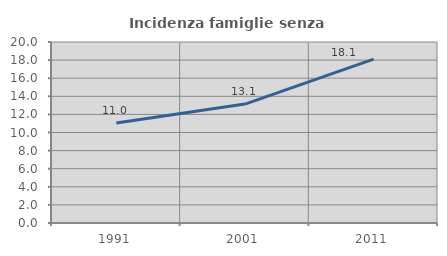
| Category | Incidenza famiglie senza nuclei |
|---|---|
| 1991.0 | 11.047 |
| 2001.0 | 13.138 |
| 2011.0 | 18.099 |